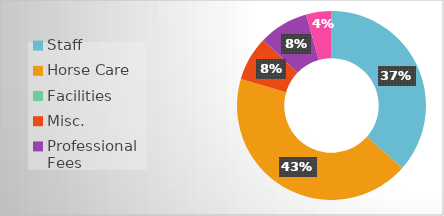
| Category | Series 0 |
|---|---|
| Staff | 13500 |
| Horse Care | 15900 |
| Facilities | 0 |
| Misc. | 2820 |
| Professional Fees | 3140 |
| Insurance | 1600 |